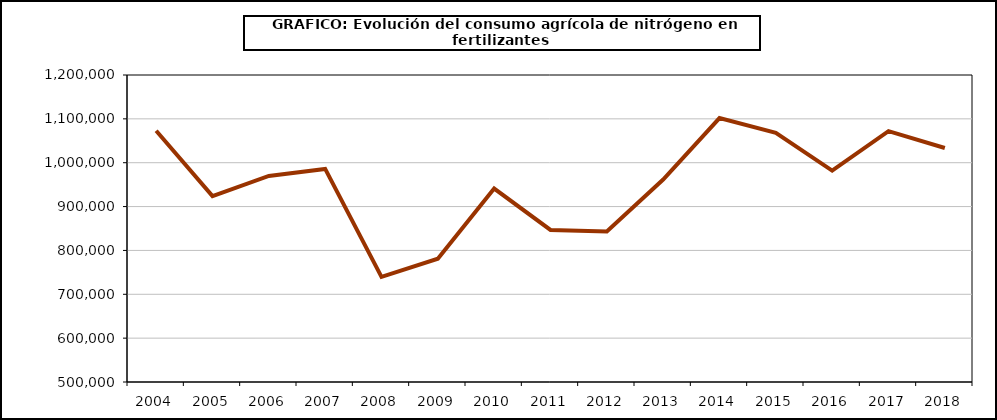
| Category | fertilizantes |
|---|---|
| 2004.0 | 1072949 |
| 2005.0 | 923764 |
| 2006.0 | 969783 |
| 2007.0 | 985857 |
| 2008.0 | 739757 |
| 2009.0 | 781069 |
| 2010.0 | 940984 |
| 2011.0 | 846697 |
| 2012.0 | 843410 |
| 2013.0 | 961507 |
| 2014.0 | 1101895 |
| 2015.0 | 1068103 |
| 2016.0 | 982155 |
| 2017.0 | 1072125 |
| 2018.0 | 1033494 |